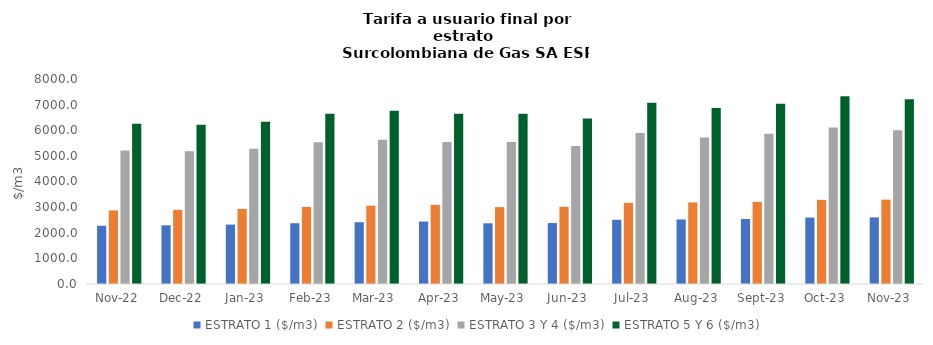
| Category | ESTRATO 1 ($/m3) | ESTRATO 2 ($/m3) | ESTRATO 3 Y 4 ($/m3) | ESTRATO 5 Y 6 ($/m3) |
|---|---|---|---|---|
| 2022-11-01 | 2272.91 | 2871.69 | 5208.48 | 6250.176 |
| 2022-12-01 | 2290.39 | 2893.78 | 5177.58 | 6213.096 |
| 2023-01-01 | 2319.28 | 2930.28 | 5279.8 | 6335.76 |
| 2023-02-01 | 2371.01 | 3007.35 | 5533.45 | 6640.14 |
| 2023-03-01 | 2411.54 | 3057.29 | 5630.28 | 6756.336 |
| 2023-04-01 | 2436.88 | 3089.41 | 5539.66 | 6647.592 |
| 2023-05-01 | 2368.72 | 3000.27 | 5539.66 | 6647.592 |
| 2023-06-01 | 2379.07 | 3013.38 | 5382.53 | 6459.036 |
| 2023-07-01 | 2506.06 | 3167.43 | 5894.36 | 7073.232 |
| 2023-08-01 | 2518.61 | 3183.29 | 5720.38 | 6864.456 |
| 2023-09-01 | 2536.22 | 3205.55 | 5864.55 | 7037.46 |
| 2023-10-01 | 2592.91 | 3282.61 | 6107.41 | 7328.892 |
| 2023-11-01 | 2599.39 | 3290.81 | 6004.48 | 7205.376 |